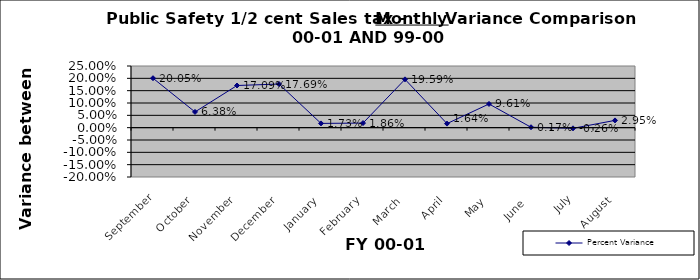
| Category | Percent Variance |
|---|---|
| September | 0.201 |
| October | 0.064 |
| November | 0.171 |
| December | 0.177 |
| January | 0.017 |
| February | 0.019 |
| March | 0.196 |
| April | 0.016 |
| May | 0.096 |
| June  | 0.002 |
| July | -0.003 |
| August | 0.029 |